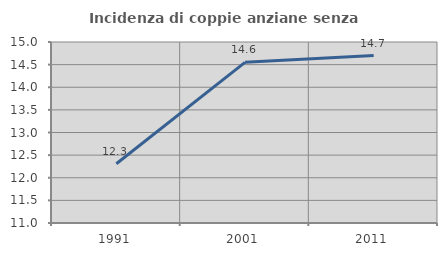
| Category | Incidenza di coppie anziane senza figli  |
|---|---|
| 1991.0 | 12.309 |
| 2001.0 | 14.551 |
| 2011.0 | 14.701 |